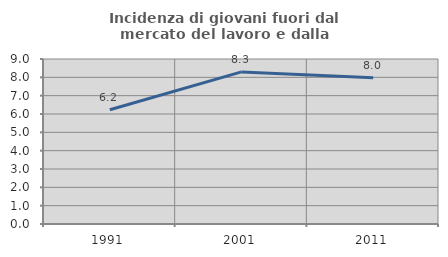
| Category | Incidenza di giovani fuori dal mercato del lavoro e dalla formazione  |
|---|---|
| 1991.0 | 6.231 |
| 2001.0 | 8.297 |
| 2011.0 | 7.975 |